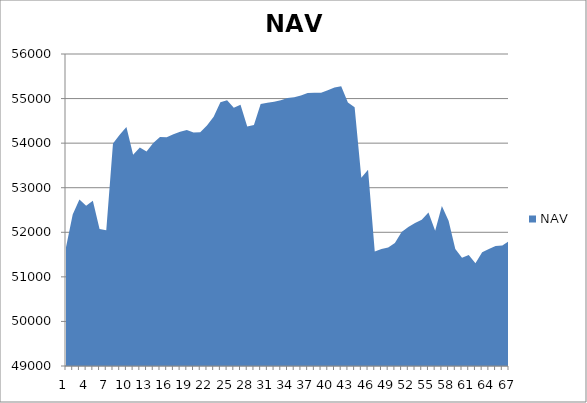
| Category | NAV |
|---|---|
| 0 | 51667 |
| 1 | 52397 |
| 2 | 52733.957 |
| 3 | 52597.875 |
| 4 | 52708.772 |
| 5 | 52075.184 |
| 6 | 52046.775 |
| 7 | 53991.219 |
| 8 | 54189.909 |
| 9 | 54364.909 |
| 10 | 53739.909 |
| 11 | 53899.542 |
| 12 | 53812.294 |
| 13 | 54003.961 |
| 14 | 54140.037 |
| 15 | 54132.37 |
| 16 | 54197.37 |
| 17 | 54255.812 |
| 18 | 54292.622 |
| 19 | 54240.699 |
| 20 | 54246.834 |
| 21 | 54397.391 |
| 22 | 54592.197 |
| 23 | 54920.119 |
| 24 | 54963.245 |
| 25 | 54796.799 |
| 26 | 54863.963 |
| 27 | 54375.975 |
| 28 | 54409.015 |
| 29 | 54878.402 |
| 30 | 54905.151 |
| 31 | 54927.958 |
| 32 | 54964.157 |
| 33 | 55012.385 |
| 34 | 55031.616 |
| 35 | 55070.791 |
| 36 | 55126.461 |
| 37 | 55131.71 |
| 38 | 55133.391 |
| 39 | 55184.783 |
| 40 | 55249.119 |
| 41 | 55278.196 |
| 42 | 54909.993 |
| 43 | 54807.052 |
| 44 | 53224.092 |
| 45 | 53401.214 |
| 46 | 51567.133 |
| 47 | 51627.536 |
| 48 | 51656.382 |
| 49 | 51762.295 |
| 50 | 52007.329 |
| 51 | 52120.149 |
| 52 | 52206.26 |
| 53 | 52279.944 |
| 54 | 52443.406 |
| 55 | 52034.315 |
| 56 | 52592.093 |
| 57 | 52259.795 |
| 58 | 51622.988 |
| 59 | 51427.586 |
| 60 | 51492.401 |
| 61 | 51307.336 |
| 62 | 51550.9 |
| 63 | 51625.058 |
| 64 | 51693.986 |
| 65 | 51704.014 |
| 66 | 51802.294 |